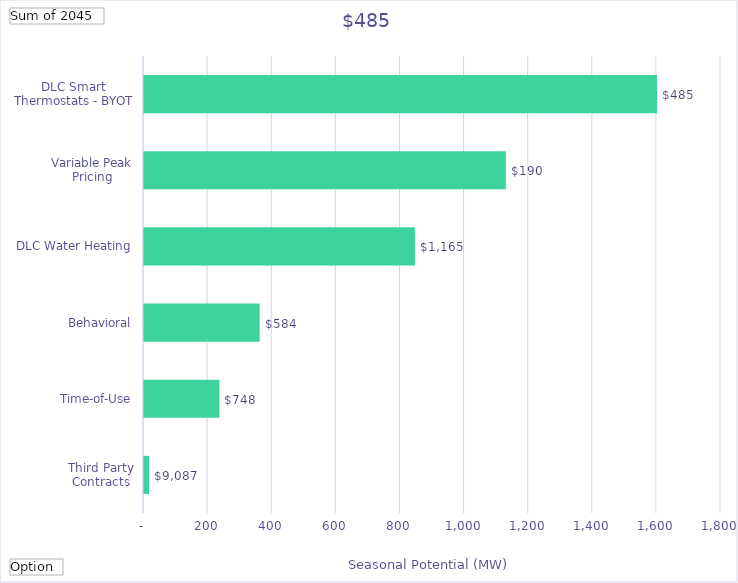
| Category | Winter Peak Reduction @Meter  (Therms) |
|---|---|
| Third Party Contracts | 15.759 |
| Time-of-Use | 235.33 |
| Behavioral | 360.676 |
| DLC Water Heating | 845.176 |
| Variable Peak Pricing | 1128.714 |
| DLC Smart Thermostats - BYOT | 1600.359 |